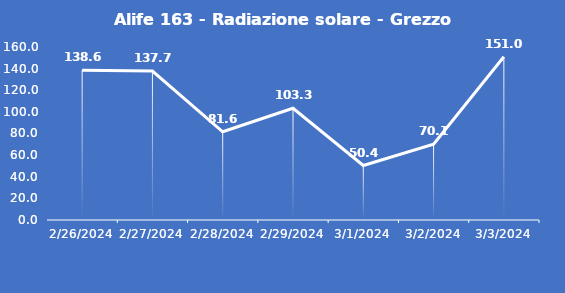
| Category | Alife 163 - Radiazione solare - Grezzo (W/m2) |
|---|---|
| 2/26/24 | 138.6 |
| 2/27/24 | 137.7 |
| 2/28/24 | 81.6 |
| 2/29/24 | 103.3 |
| 3/1/24 | 50.4 |
| 3/2/24 | 70.1 |
| 3/3/24 | 151 |